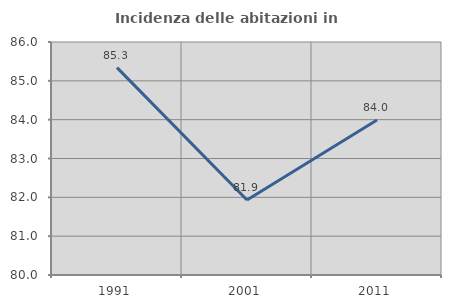
| Category | Incidenza delle abitazioni in proprietà  |
|---|---|
| 1991.0 | 85.339 |
| 2001.0 | 81.933 |
| 2011.0 | 83.99 |